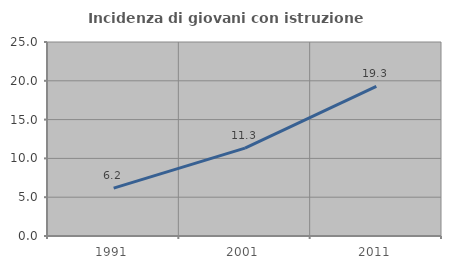
| Category | Incidenza di giovani con istruzione universitaria |
|---|---|
| 1991.0 | 6.173 |
| 2001.0 | 11.317 |
| 2011.0 | 19.28 |